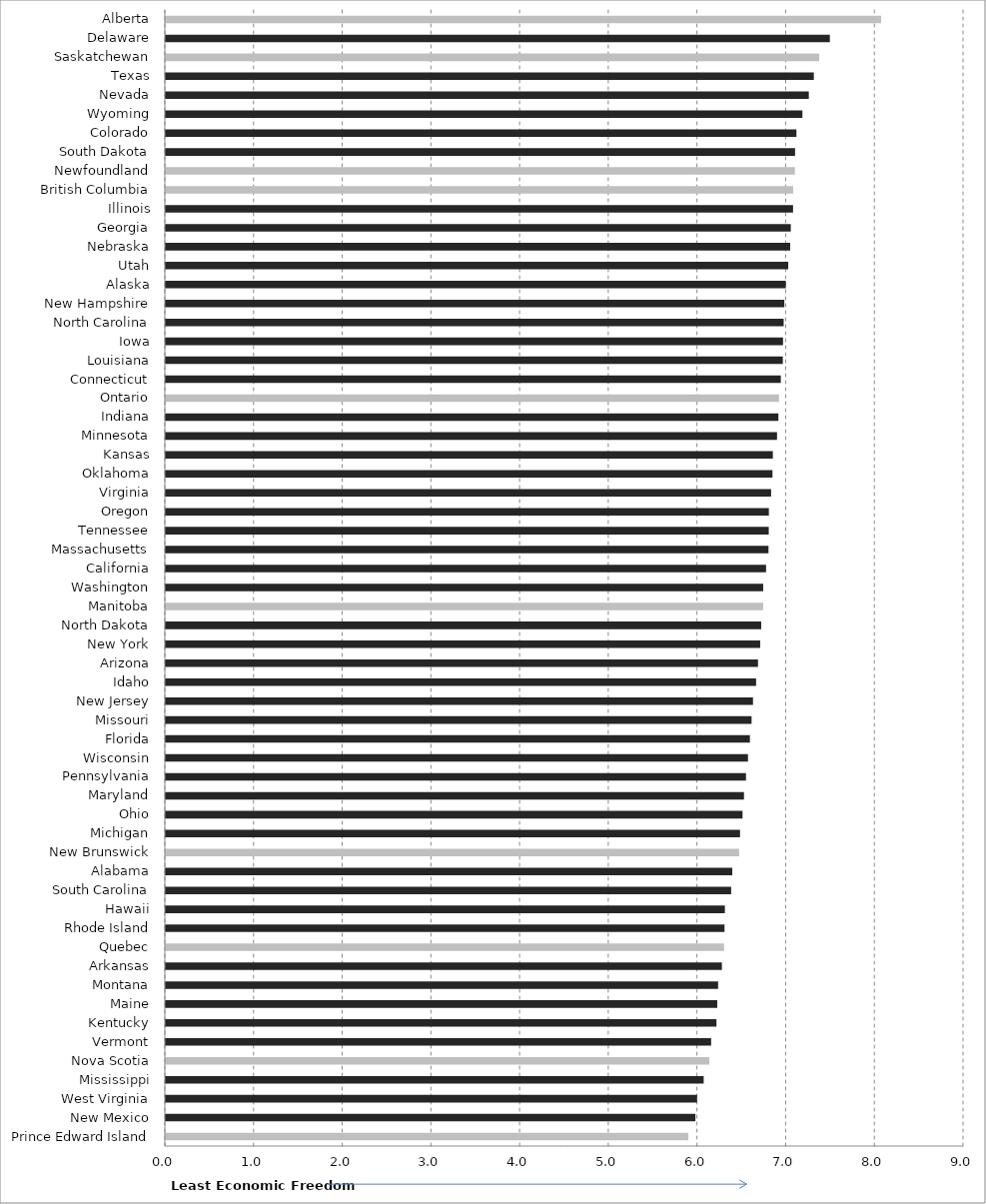
| Category | Series 0 |
|---|---|
| Prince Edward Island | 5.892 |
| New Mexico | 5.971 |
| West Virginia | 5.99 |
| Mississippi | 6.064 |
| Nova Scotia | 6.128 |
| Vermont | 6.149 |
| Kentucky | 6.209 |
| Maine | 6.218 |
| Montana | 6.227 |
| Arkansas | 6.27 |
| Quebec | 6.294 |
| Rhode Island | 6.3 |
| Hawaii | 6.304 |
| South Carolina | 6.374 |
| Alabama | 6.387 |
| New Brunswick | 6.464 |
| Michigan | 6.474 |
| Ohio | 6.503 |
| Maryland | 6.519 |
| Pennsylvania | 6.542 |
| Wisconsin | 6.564 |
| Florida | 6.586 |
| Missouri | 6.605 |
| New Jersey | 6.621 |
| Idaho | 6.656 |
| Arizona | 6.677 |
| New York | 6.702 |
| North Dakota | 6.713 |
| Manitoba | 6.735 |
| Washington | 6.736 |
| California | 6.768 |
| Massachusetts | 6.795 |
| Tennessee | 6.798 |
| Oregon | 6.8 |
| Virginia | 6.825 |
| Oklahoma | 6.84 |
| Kansas | 6.844 |
| Minnesota | 6.892 |
| Indiana | 6.907 |
| Ontario | 6.914 |
| Connecticut | 6.934 |
| Louisiana | 6.957 |
| Iowa | 6.959 |
| North Carolina | 6.966 |
| New Hampshire | 6.974 |
| Alaska | 6.99 |
| Utah | 7.018 |
| Nebraska | 7.04 |
| Georgia | 7.047 |
| Illinois | 7.072 |
| British Columbia | 7.074 |
| Newfoundland | 7.093 |
| South Dakota | 7.095 |
| Colorado | 7.111 |
| Wyoming | 7.178 |
| Nevada | 7.25 |
| Texas | 7.307 |
| Saskatchewan | 7.366 |
| Delaware | 7.487 |
| Alberta | 8.065 |